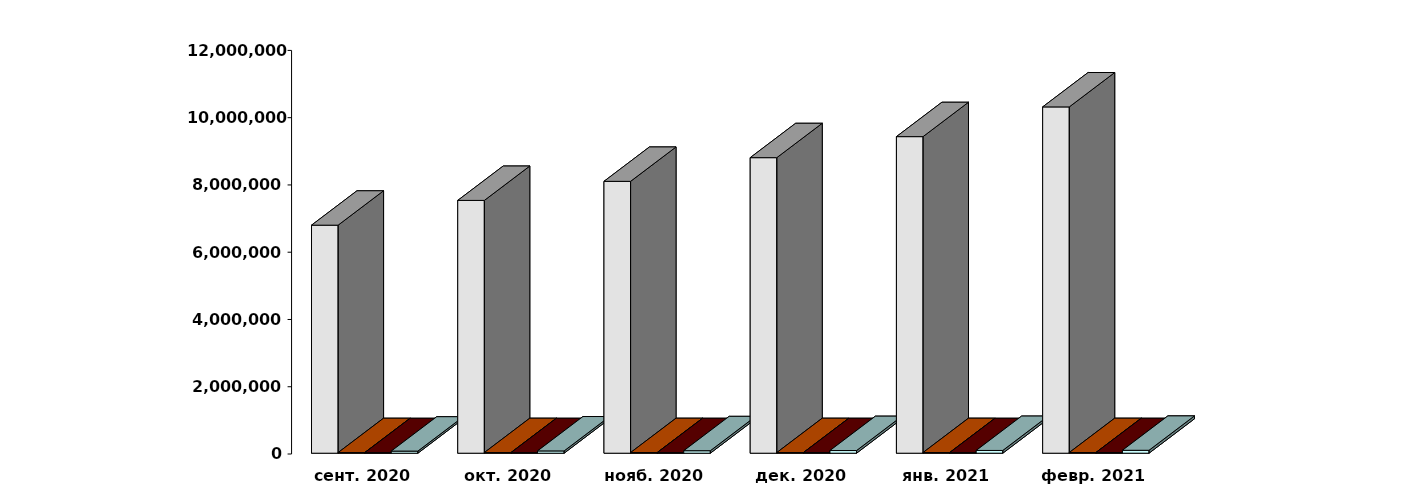
| Category | Физические лица | Юридические лица | Иностранные лица | Клиенты, передавшие свои средства в ДУ |
|---|---|---|---|---|
| 2020-09-28 | 6779757 | 18484 | 16494 | 62564 |
| 2020-10-28 | 7515934 | 18680 | 16861 | 67792 |
| 2020-11-28 | 8083085 | 18780 | 17081 | 73469 |
| 2020-12-28 | 8787077 | 19014 | 17268 | 79270 |
| 2021-01-28 | 9412672 | 19074 | 17041 | 82193 |
| 2021-02-28 | 10296032 | 19173 | 17445 | 86734 |